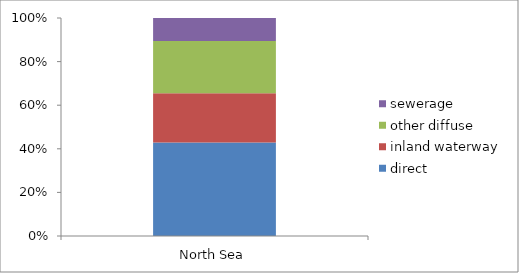
| Category | direct | inland waterway | other diffuse | sewerage |
|---|---|---|---|---|
| North Sea | 240236.75 | 125896.75 | 134188.5 | 59154.5 |